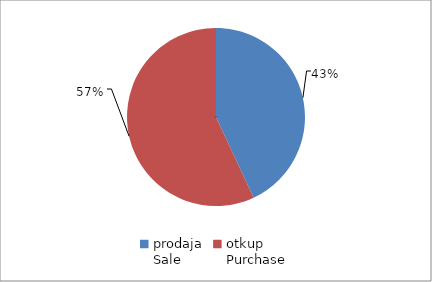
| Category | Series 0 |
|---|---|
| prodaja
Sale | 9299620 |
| otkup
Purchase | 12297950.35 |